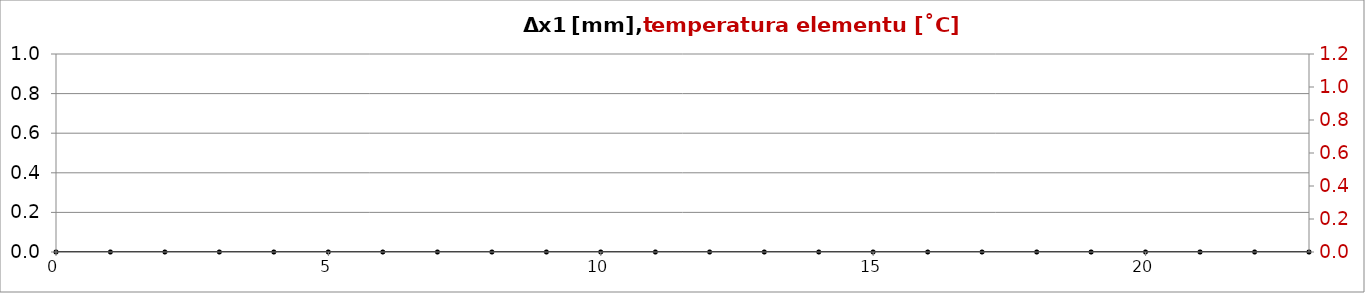
| Category | dx1 |
|---|---|
| 0.0 | 0 |
| 1.0 | 0 |
| 2.0 | 0 |
| 3.0 | 0 |
| 4.0 | 0 |
| 5.0 | 0 |
| 6.0 | 0 |
| 7.0 | 0 |
| 8.0 | 0 |
| 9.0 | 0 |
| 10.0 | 0 |
| 11.0 | 0 |
| 12.0 | 0 |
| 13.0 | 0 |
| 14.0 | 0 |
| 15.0 | 0 |
| 16.0 | 0 |
| 17.0 | 0 |
| 18.0 | 0 |
| 19.0 | 0 |
| 20.0 | 0 |
| 21.0 | 0 |
| 22.0 | 0 |
| 23.0 | 0 |